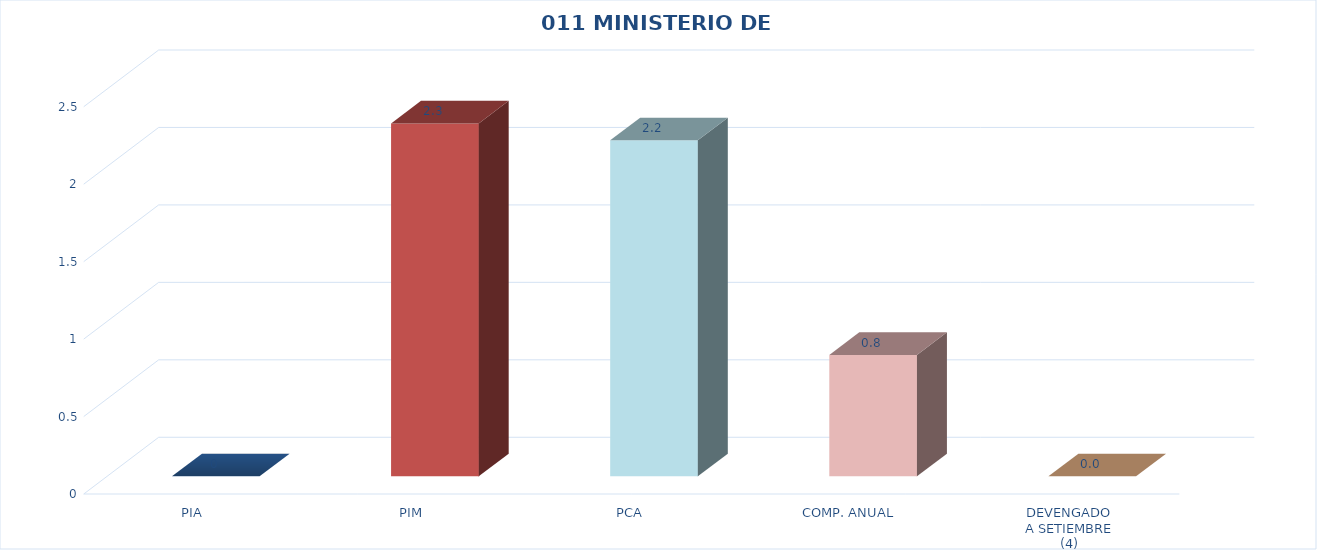
| Category | 011 MINISTERIO DE SALUD |
|---|---|
| PIA | 0 |
| PIM | 2.278 |
| PCA | 2.169 |
| COMP. ANUAL | 0.783 |
| DEVENGADO
A SETIEMBRE
(4) | 0 |